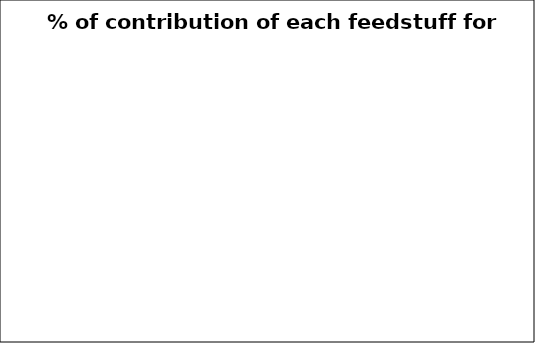
| Category | % of contribution off each feedstuff for Proteins |
|---|---|
| 0.0 | 0 |
| 0.0 | 0 |
| 0.0 | 0 |
| 0.0 | 0 |
| 0.0 | 0 |
| 0.0 | 0 |
| 0.0 | 0 |
| 0.0 | 0 |
| 0.0 | 0 |
| 0.0 | 0 |
| 0.0 | 0 |
| 0.0 | 0 |